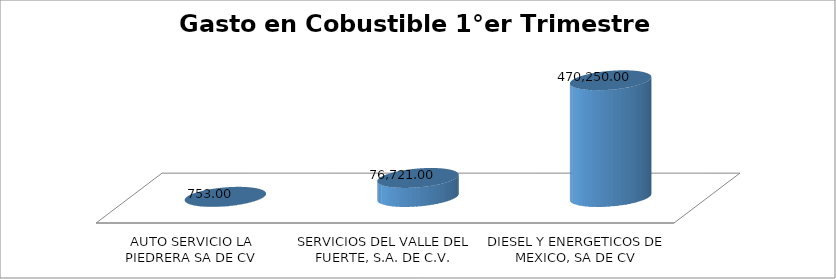
| Category | Suma |
|---|---|
| AUTO SERVICIO LA PIEDRERA SA DE CV | 753 |
| SERVICIOS DEL VALLE DEL FUERTE, S.A. DE C.V. | 76721 |
| DIESEL Y ENERGETICOS DE MEXICO, SA DE CV | 470250 |